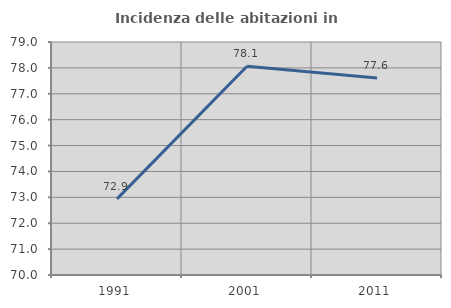
| Category | Incidenza delle abitazioni in proprietà  |
|---|---|
| 1991.0 | 72.941 |
| 2001.0 | 78.063 |
| 2011.0 | 77.608 |